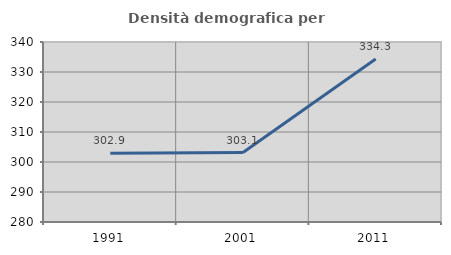
| Category | Densità demografica |
|---|---|
| 1991.0 | 302.945 |
| 2001.0 | 303.148 |
| 2011.0 | 334.325 |